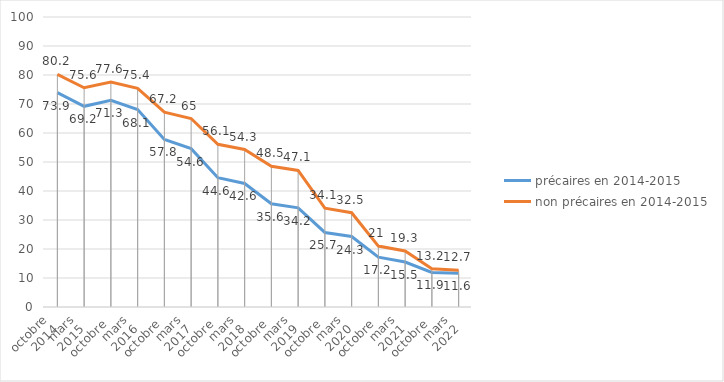
| Category | précaires en 2014-2015 | non précaires en 2014-2015 |
|---|---|---|
| 0 | 73.9 | 80.2 |
| 1 | 69.2 | 75.6 |
| 2 | 71.3 | 77.6 |
| 3 | 68.1 | 75.4 |
| 4 | 57.8 | 67.2 |
| 5 | 54.6 | 65 |
| 6 | 44.6 | 56.1 |
| 7 | 42.6 | 54.3 |
| 8 | 35.6 | 48.5 |
| 9 | 34.2 | 47.1 |
| 10 | 25.7 | 34.1 |
| 11 | 24.3 | 32.5 |
| 12 | 17.2 | 21 |
| 13 | 15.5 | 19.3 |
| 14 | 11.9 | 13.2 |
| 15 | 11.6 | 12.7 |